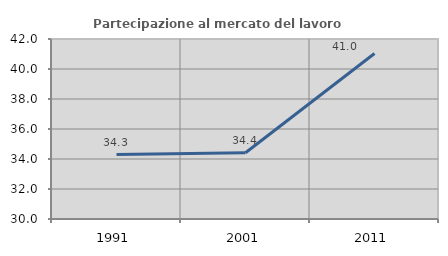
| Category | Partecipazione al mercato del lavoro  femminile |
|---|---|
| 1991.0 | 34.295 |
| 2001.0 | 34.416 |
| 2011.0 | 41.034 |